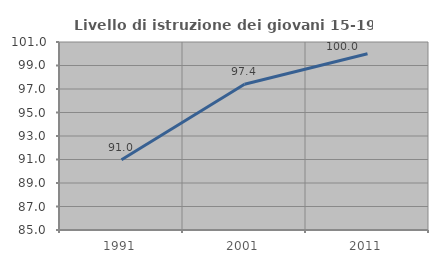
| Category | Livello di istruzione dei giovani 15-19 anni |
|---|---|
| 1991.0 | 90.984 |
| 2001.0 | 97.403 |
| 2011.0 | 100 |